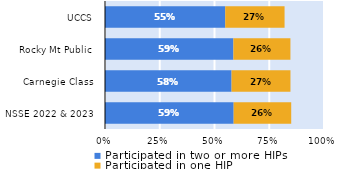
| Category | Participated in two or more HIPs | Participated in one HIP |
|---|---|---|
| NSSE 2022 & 2023 | 0.587 | 0.263 |
| Carnegie Class | 0.578 | 0.269 |
| Rocky Mt Public | 0.586 | 0.26 |
| UCCS | 0.549 | 0.271 |